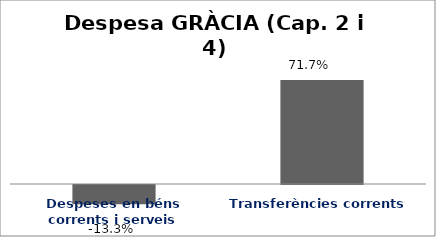
| Category | Series 0 |
|---|---|
| Despeses en béns corrents i serveis | -0.133 |
| Transferències corrents | 0.717 |